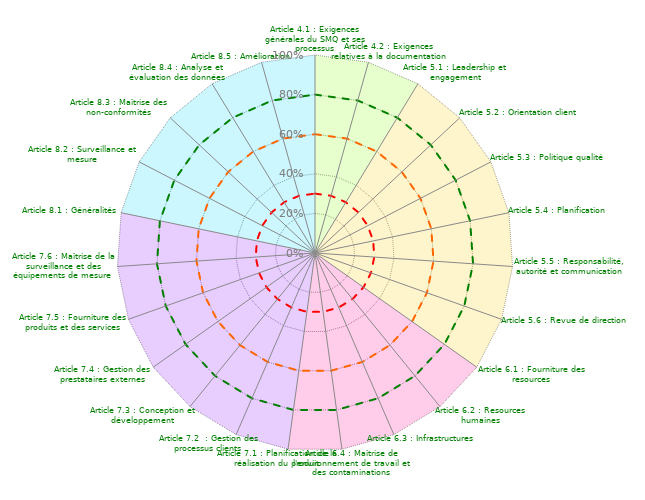
| Category | Coloriage Art 4 | Coloriage Art 5 | Coloriage Art  6 | Coloriage Art 7 | Coloriage Art 8 | Conforme | Convaincant | Informel | Evaluation Mutuelle |
|---|---|---|---|---|---|---|---|---|---|
| Article 4.1 : Exigences générales du SMQ et ses processus | 1 | 0 | 0 | 0 | 1 | 0.8 | 0.6 | 0.3 | 0 |
| Article 4.2 : Exigences relatives à la documentation | 1 | 0 | 0 | 0 | 0 | 0.8 | 0.6 | 0.3 | 0 |
| Article 5.1 : Leadership et engagement | 1 | 1 | 0 | 0 | 0 | 0.8 | 0.6 | 0.3 | 0 |
| Article 5.2 : Orientation client | 0 | 1 | 0 | 0 | 0 | 0.8 | 0.6 | 0.3 | 0 |
| Article 5.3 : Politique qualité | 0 | 1 | 0 | 0 | 0 | 0.8 | 0.6 | 0.3 | 0 |
| Article 5.4 : Planification | 0 | 1 | 0 | 0 | 0 | 0.8 | 0.6 | 0.3 | 0 |
| Article 5.5 : Responsabilité, autorité et communication | 0 | 1 | 0 | 0 | 0 | 0.8 | 0.6 | 0.3 | 0 |
| Article 5.6 : Revue de direction | 0 | 1 | 0 | 0 | 0 | 0.8 | 0.6 | 0.3 | 0 |
| Article 6.1 : Fourniture des resources | 0 | 1 | 1 | 0 | 0 | 0.8 | 0.6 | 0.3 | 0 |
| Article 6.2 : Resources humaines | 0 | 0 | 1 | 0 | 0 | 0.8 | 0.6 | 0.3 | 0 |
| Article 6.3 : Infrastructures | 0 | 0 | 1 | 0 | 0 | 0.8 | 0.6 | 0.3 | 0 |
| Article 6.4 : Maîtrise de l'environnement de travail et des contaminations | 0 | 0 | 1 | 0 | 0 | 0.8 | 0.6 | 0.3 | 0 |
| Article 7.1 : Planification de la réalisation du produit | 0 | 0 | 1 | 1 | 0 | 0.8 | 0.6 | 0.3 | 0 |
| Article 7.2  : Gestion des processus clients | 0 | 0 | 0 | 1 | 0 | 0.8 | 0.6 | 0.3 | 0 |
| Article 7.3 : Conception et développement | 0 | 0 | 0 | 1 | 0 | 0.8 | 0.6 | 0.3 | 0 |
| Article 7.4 : Gestion des prestataires externes | 0 | 0 | 0 | 1 | 0 | 0.8 | 0.6 | 0.3 | 0 |
| Article 7.5 : Fourniture des produits et des services | 0 | 0 | 0 | 1 | 0 | 0.8 | 0.6 | 0.3 | 0 |
| Article 7.6 : Maîtrise de la surveillance et des équipements de mesure  | 0 | 0 | 0 | 1 | 0 | 0.8 | 0.6 | 0.3 | 0 |
| Article 8.1 : Généralités | 0 | 0 | 0 | 1 | 1 | 0.8 | 0.6 | 0.3 | 0 |
| Article 8.2 : Surveillance et mesure | 0 | 0 | 0 | 0 | 1 | 0.8 | 0.6 | 0.3 | 0 |
| Article 8.3 : Maîtrise des non-conformités | 0 | 0 | 0 | 0 | 1 | 0.8 | 0.6 | 0.3 | 0 |
| Article 8.4 : Analyse et évaluation des données | 0 | 0 | 0 | 0 | 1 | 0.8 | 0.6 | 0.3 | 0 |
| Article 8.5 : Amélioration | 0 | 0 | 0 | 0 | 1 | 0.8 | 0.6 | 0.3 | 0 |